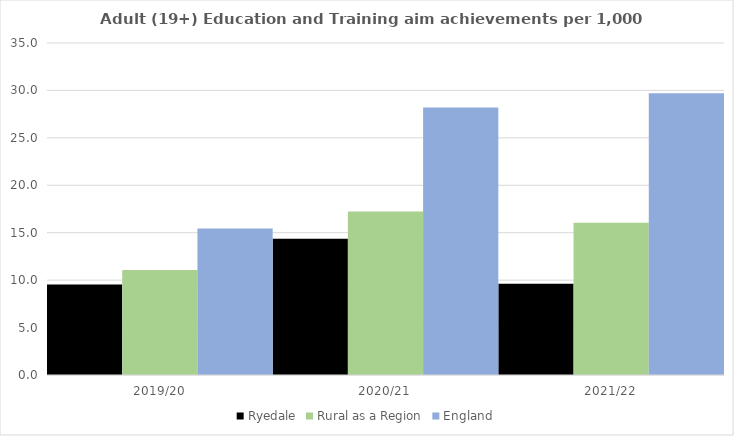
| Category | Ryedale | Rural as a Region | England |
|---|---|---|---|
| 2019/20 | 9.552 | 11.081 | 15.446 |
| 2020/21 | 14.357 | 17.224 | 28.211 |
| 2021/22 | 9.632 | 16.063 | 29.711 |